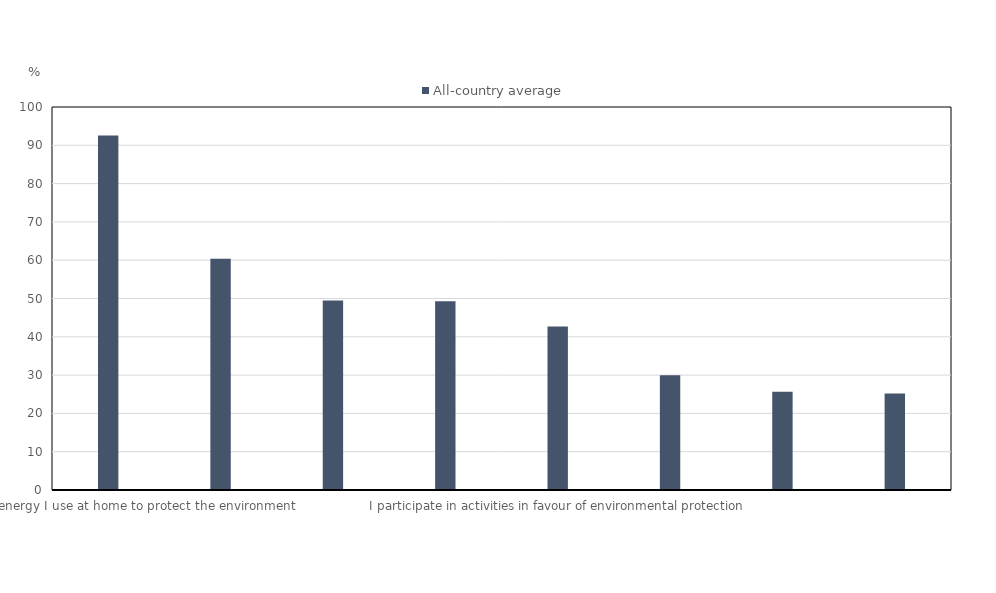
| Category | All-country average |
|---|---|
| I reduce the energy I use at home to protect the environment | 92.531 |
| I choose certain products for ethical or environmental reasons,
even if they are a bit more expensive | 60.366 |
| I keep myself informed about world events via <Twitter> or <Facebook> | 49.46 |
| I regularly read websites on international social issues (e.g. poverty, human rights) | 49.286 |
| I participate in activities in favour of environmental protection | 42.714 |
| I participate in activities promoting equality between men and women | 29.942 |
| I sign environmental or social petitions on line | 25.663 |
| I boycott products or companies for political, ethical or environmental reasons | 25.208 |